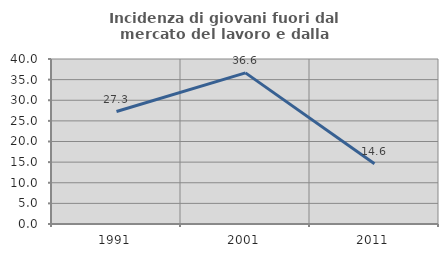
| Category | Incidenza di giovani fuori dal mercato del lavoro e dalla formazione  |
|---|---|
| 1991.0 | 27.273 |
| 2001.0 | 36.634 |
| 2011.0 | 14.607 |